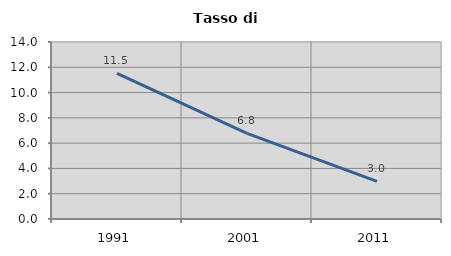
| Category | Tasso di disoccupazione   |
|---|---|
| 1991.0 | 11.515 |
| 2001.0 | 6.771 |
| 2011.0 | 2.97 |